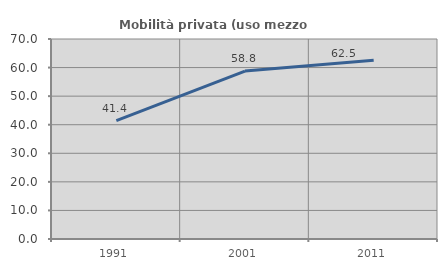
| Category | Mobilità privata (uso mezzo privato) |
|---|---|
| 1991.0 | 41.429 |
| 2001.0 | 58.766 |
| 2011.0 | 62.544 |